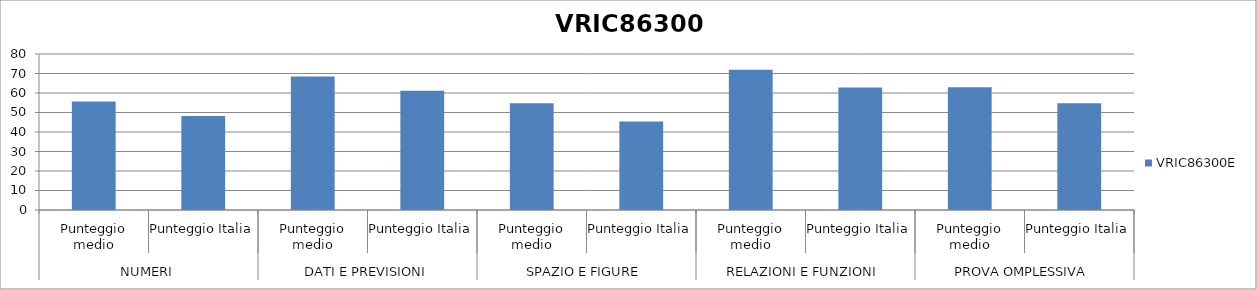
| Category | VRIC86300E |
|---|---|
| 0 | 55.6 |
| 1 | 48.2 |
| 2 | 68.4 |
| 3 | 61.1 |
| 4 | 54.8 |
| 5 | 45.4 |
| 6 | 71.9 |
| 7 | 62.8 |
| 8 | 63 |
| 9 | 54.7 |